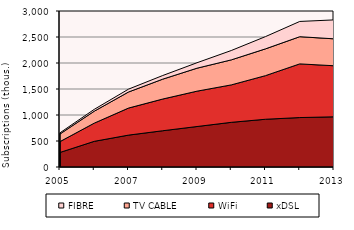
| Category | xDSL | WiFi | TV CABLE | FIBRE |
|---|---|---|---|---|
| 2005.0 | 279.853 | 208.875 | 146.3 | 22.691 |
| 2006.0 | 493.402 | 350 | 229.78 | 35.495 |
| 2007.0 | 613.22 | 520 | 309 | 55 |
| 2008.0 | 697.2 | 609.9 | 382.5 | 70 |
| 2009.0 | 778.3 | 680 | 441.7 | 105 |
| 2010.0 | 859 | 720 | 481 | 180 |
| 2011.0 | 918 | 839 | 515 | 235.8 |
| 2012.1 | 951 | 1032 | 523 | 293 |
| 2013.0 | 965 | 982 | 518 | 364 |